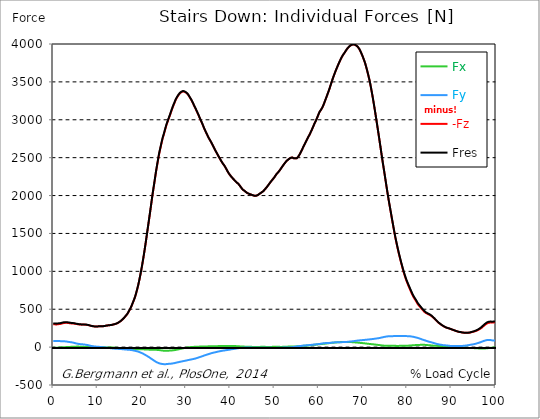
| Category |  Fx |  Fy |  -Fz |  Fres |
|---|---|---|---|---|
| 0.0 | -9.87 | 81.06 | 300.68 | 311.73 |
| 0.167348456675344 | -9.61 | 81.22 | 300.75 | 311.83 |
| 0.334696913350688 | -9.27 | 81.24 | 300.49 | 311.58 |
| 0.5020453700260321 | -8.63 | 80.74 | 299.02 | 310.01 |
| 0.669393826701376 | -8.05 | 80.57 | 298.9 | 309.84 |
| 0.83674228337672 | -7.43 | 80.36 | 299.57 | 310.44 |
| 1.0040907400520642 | -6.73 | 80.41 | 301.56 | 312.37 |
| 1.1621420602454444 | -6.07 | 80.19 | 303.34 | 314.04 |
| 1.3294905169207885 | -5.4 | 79.68 | 304.59 | 315.11 |
| 1.4968389735961325 | -4.64 | 79.14 | 305.43 | 315.78 |
| 1.6641874302714765 | -3.96 | 78.68 | 306.74 | 316.94 |
| 1.8315358869468206 | -3.35 | 78.41 | 309.16 | 319.22 |
| 1.9988843436221646 | -2.82 | 78.29 | 312.47 | 322.41 |
| 2.1662328002975086 | -2.22 | 78.15 | 315.49 | 325.32 |
| 2.333581256972853 | -1.74 | 77.76 | 317.91 | 327.61 |
| 2.5009297136481967 | -1.22 | 76.89 | 319.31 | 328.8 |
| 2.6682781703235405 | -0.68 | 75.85 | 319.89 | 329.13 |
| 2.8356266269988843 | -0.17 | 74.73 | 320.02 | 329.01 |
| 3.002975083674229 | 0.75 | 73.56 | 320.14 | 328.84 |
| 3.1703235403495724 | 1.17 | 71.71 | 319.48 | 327.86 |
| 3.337671997024917 | 1.59 | 69.95 | 318.71 | 326.77 |
| 3.4957233172182973 | 2.05 | 68.48 | 317.52 | 325.3 |
| 3.663071773893641 | 2.57 | 67.01 | 315.68 | 323.19 |
| 3.8304202305689854 | 3.04 | 65.5 | 313.83 | 321.08 |
| 3.997768687244329 | 3.43 | 64.31 | 312.91 | 319.89 |
| 4.165117143919673 | 4.09 | 62.61 | 312.43 | 319.03 |
| 4.332465600595017 | 4.8 | 60.68 | 312.2 | 318.37 |
| 4.499814057270361 | 5.1 | 58.81 | 311.43 | 317.23 |
| 4.667162513945706 | 5.5 | 56.49 | 310.18 | 315.61 |
| 4.834510970621049 | 6.02 | 53.44 | 308.57 | 313.5 |
| 5.001859427296393 | 6.24 | 50.58 | 306.73 | 311.23 |
| 5.169207883971737 | 6.32 | 48.52 | 305.13 | 309.37 |
| 5.336556340647081 | 6.47 | 46.46 | 303.63 | 307.61 |
| 5.503904797322425 | 6.55 | 44.32 | 301.85 | 305.6 |
| 5.671253253997769 | 6.57 | 42.31 | 300.2 | 303.73 |
| 5.82930457419115 | 6.32 | 40.95 | 299.17 | 302.55 |
| 5.996653030866494 | 6.04 | 39.68 | 298.22 | 301.47 |
| 6.164001487541838 | 5.73 | 38.55 | 297.34 | 300.45 |
| 6.331349944217181 | 5.15 | 37.7 | 296.62 | 299.64 |
| 6.498698400892526 | 4.4 | 37.03 | 296.64 | 299.58 |
| 6.66604685756787 | 3.85 | 36.33 | 297.03 | 299.91 |
| 6.833395314243213 | 3.39 | 35.4 | 297.19 | 300 |
| 7.000743770918558 | 3.06 | 34.2 | 296.98 | 299.68 |
| 7.168092227593902 | 2.97 | 32.69 | 296.34 | 298.92 |
| 7.335440684269246 | 3.07 | 31.08 | 295.44 | 297.83 |
| 7.50278914094459 | 3.22 | 29.48 | 294.13 | 296.36 |
| 7.6701375976199335 | 3.4 | 27.78 | 292.66 | 294.71 |
| 7.837486054295278 | 3.62 | 25.64 | 291.08 | 292.94 |
| 7.995537374488658 | 3.93 | 23.24 | 289 | 290.63 |
| 8.162885831164003 | 4.21 | 20.67 | 286.07 | 287.42 |
| 8.330234287839346 | 4.32 | 18.23 | 283.34 | 284.44 |
| 8.49758274451469 | 4.36 | 15.88 | 280.8 | 281.65 |
| 8.664931201190035 | 4.09 | 13.93 | 278.52 | 279.18 |
| 8.832279657865378 | 3.6 | 12.36 | 276.69 | 277.25 |
| 8.999628114540721 | 3.27 | 10.73 | 274.9 | 275.38 |
| 9.166976571216066 | 2.93 | 9.13 | 273.18 | 273.59 |
| 9.334325027891412 | 2.33 | 8.17 | 272.57 | 272.94 |
| 9.501673484566755 | 1.8 | 7.27 | 272.01 | 272.36 |
| 9.669021941242098 | 1.38 | 6.34 | 271.68 | 271.99 |
| 9.836370397917442 | 0.93 | 5.45 | 271.91 | 272.2 |
| 10.003718854592787 | 0.4 | 4.7 | 272.56 | 272.84 |
| 10.17106731126813 | -0.19 | 3.99 | 273.32 | 273.58 |
| 10.329118631461512 | -0.92 | 3.58 | 274.99 | 275.22 |
| 10.496467088136853 | -1.05 | 2.7 | 275.24 | 275.42 |
| 10.663815544812199 | -1.04 | 1.58 | 275.31 | 275.43 |
| 10.831164001487544 | -0.9 | 0.2 | 275.3 | 275.37 |
| 10.998512458162887 | -1.23 | -0.65 | 275.55 | 275.62 |
| 11.16586091483823 | -1.66 | -1.4 | 275.87 | 275.93 |
| 11.333209371513574 | -2.22 | -2.45 | 276.49 | 276.57 |
| 11.50055782818892 | -2.75 | -3.55 | 277.63 | 277.73 |
| 11.667906284864264 | -3.09 | -4.79 | 279.52 | 279.67 |
| 11.835254741539607 | -3.44 | -5.88 | 281.53 | 281.71 |
| 12.00260319821495 | -4.05 | -6.41 | 283.85 | 284.07 |
| 12.169951654890292 | -4.5 | -7.36 | 285.92 | 286.17 |
| 12.337300111565641 | -4.56 | -8.98 | 286.66 | 286.96 |
| 12.504648568240984 | -4.62 | -10.45 | 287.4 | 287.75 |
| 12.662699888434362 | -4.74 | -11.94 | 288.67 | 289.08 |
| 12.830048345109708 | -4.69 | -13.38 | 289.93 | 290.39 |
| 12.997396801785053 | -4.81 | -14.74 | 291.21 | 291.72 |
| 13.164745258460396 | -5.08 | -15.98 | 292.65 | 293.23 |
| 13.33209371513574 | -5.54 | -17.07 | 294.55 | 295.21 |
| 13.499442171811083 | -6.07 | -18.04 | 296.88 | 297.6 |
| 13.666790628486426 | -6.78 | -18.85 | 299.77 | 300.55 |
| 13.834139085161771 | -7.07 | -20.04 | 302.29 | 303.14 |
| 14.001487541837117 | -7.63 | -20.96 | 305.02 | 305.94 |
| 14.16883599851246 | -8.45 | -21.62 | 307.96 | 308.94 |
| 14.336184455187803 | -9.51 | -22.16 | 311.47 | 312.53 |
| 14.503532911863147 | -10.53 | -22.63 | 316.08 | 317.19 |
| 14.670881368538492 | -11.47 | -23.19 | 321.49 | 322.65 |
| 14.828932688731873 | -12.33 | -23.75 | 327.62 | 328.83 |
| 14.996281145407215 | -13.32 | -24.37 | 334.1 | 335.36 |
| 15.163629602082558 | -14.11 | -25.02 | 340.87 | 342.19 |
| 15.330978058757903 | -14.67 | -25.73 | 348.7 | 350.07 |
| 15.498326515433247 | -15.54 | -26.74 | 357.08 | 358.53 |
| 15.665674972108594 | -16.48 | -28.06 | 366.16 | 367.73 |
| 15.833023428783937 | -17.21 | -29.05 | 375.84 | 377.5 |
| 16.00037188545928 | -18.05 | -29.84 | 386.11 | 387.83 |
| 16.167720342134626 | -18.74 | -30.54 | 397.23 | 399.02 |
| 16.335068798809967 | -19.18 | -31.44 | 409.01 | 410.86 |
| 16.502417255485312 | -19.6 | -32.48 | 420.75 | 422.67 |
| 16.669765712160658 | -20.21 | -33.37 | 432.83 | 434.81 |
| 16.837114168836 | -20.82 | -34.09 | 447.67 | 449.69 |
| 17.004462625511344 | -21.51 | -34.79 | 464.92 | 466.99 |
| 17.16251394570472 | -22.24 | -35.45 | 482.3 | 484.4 |
| 17.32986240238007 | -22.81 | -36.28 | 500.17 | 502.32 |
| 17.497210859055414 | -23.02 | -37.58 | 519.14 | 521.32 |
| 17.664559315730756 | -23.27 | -39.21 | 540.38 | 542.6 |
| 17.8319077724061 | -23.49 | -41.04 | 564.66 | 566.92 |
| 17.999256229081443 | -24.17 | -42.94 | 589.12 | 591.45 |
| 18.166604685756788 | -24.93 | -44.83 | 613.77 | 616.18 |
| 18.333953142432133 | -25.45 | -46.51 | 638.46 | 640.91 |
| 18.501301599107478 | -25.83 | -48.62 | 667.01 | 669.53 |
| 18.668650055782823 | -26.22 | -51.27 | 700.59 | 703.2 |
| 18.835998512458165 | -26.58 | -54.04 | 736.41 | 739.11 |
| 19.00334696913351 | -26.78 | -56.64 | 772.85 | 775.62 |
| 19.170695425808855 | -27 | -59.49 | 811.48 | 814.33 |
| 19.338043882484197 | -27.22 | -62.8 | 856.07 | 859.03 |
| 19.496095202677576 | -27.7 | -66.66 | 902.4 | 905.52 |
| 19.66344365935292 | -28.02 | -70.61 | 951.25 | 954.52 |
| 19.830792116028263 | -28.24 | -74.58 | 1002.14 | 1005.55 |
| 19.998140572703612 | -28.56 | -78.8 | 1055.29 | 1058.84 |
| 20.165489029378953 | -28.99 | -83.57 | 1111.63 | 1115.37 |
| 20.3328374860543 | -29.49 | -88.64 | 1170.52 | 1174.46 |
| 20.500185942729644 | -29.99 | -93.66 | 1231.01 | 1235.15 |
| 20.667534399404985 | -30.45 | -98.8 | 1292.83 | 1297.16 |
| 20.83488285608033 | -30.98 | -104.39 | 1357.5 | 1362.06 |
| 21.002231312755672 | -31.43 | -110.25 | 1424.52 | 1429.31 |
| 21.16957976943102 | -31.8 | -116.24 | 1492.1 | 1497.14 |
| 21.336928226106362 | -32.42 | -122.18 | 1559.61 | 1564.9 |
| 21.504276682781704 | -33.05 | -128.14 | 1627.12 | 1632.66 |
| 21.67162513945705 | -33.62 | -134.21 | 1694.7 | 1700.49 |
| 21.82967645965043 | -33.81 | -140.67 | 1762.87 | 1768.94 |
| 21.997024916325774 | -34.02 | -147.49 | 1832.67 | 1839.04 |
| 22.16437337300112 | -34.23 | -154.32 | 1902.55 | 1909.23 |
| 22.33172182967646 | -34.38 | -161.28 | 1973.12 | 1980.11 |
| 22.499070286351806 | -34.67 | -167.92 | 2040.54 | 2047.84 |
| 22.666418743027148 | -34.96 | -174.33 | 2103.62 | 2111.23 |
| 22.833767199702496 | -35.24 | -180.73 | 2166.27 | 2174.18 |
| 23.00111565637784 | -35.4 | -187.2 | 2230.76 | 2238.98 |
| 23.168464113053183 | -35.63 | -193.25 | 2295.61 | 2304.11 |
| 23.335812569728528 | -36.27 | -198.36 | 2355.71 | 2364.43 |
| 23.50316102640387 | -36.98 | -202.93 | 2412.2 | 2421.11 |
| 23.670509483079215 | -37.68 | -207.42 | 2468.08 | 2477.16 |
| 23.83785793975456 | -38.48 | -211.75 | 2523.3 | 2532.56 |
| 23.995909259947936 | -39.84 | -214.85 | 2572.31 | 2581.67 |
| 24.163257716623285 | -41.15 | -217.18 | 2615.1 | 2624.52 |
| 24.330606173298627 | -42.65 | -219.55 | 2658.87 | 2668.35 |
| 24.49795462997397 | -44.15 | -221.92 | 2702.64 | 2712.19 |
| 24.665303086649313 | -45.49 | -223.79 | 2744.71 | 2754.28 |
| 24.83265154332466 | -46.6 | -224.42 | 2778.06 | 2787.59 |
| 25.0 | -47.57 | -224.9 | 2811.29 | 2820.75 |
| 25.167348456675345 | -48.35 | -225.14 | 2846.09 | 2855.46 |
| 25.334696913350694 | -48.88 | -225.23 | 2882.27 | 2891.54 |
| 25.502045370026035 | -49.2 | -224.83 | 2916.69 | 2925.82 |
| 25.669393826701377 | -49.1 | -223.78 | 2945.99 | 2954.95 |
| 25.836742283376722 | -48.86 | -222.55 | 2973.88 | 2982.66 |
| 26.004090740052067 | -48.78 | -221.22 | 3001.67 | 3010.26 |
| 26.17143919672741 | -46.8 | -220.91 | 3028.11 | 3036.58 |
| 26.329490516920792 | -44.92 | -220.56 | 3055.15 | 3063.49 |
| 26.49683897359613 | -43.84 | -219.71 | 3083.92 | 3092.1 |
| 26.66418743027148 | -43.55 | -217.98 | 3112.31 | 3120.3 |
| 26.831535886946828 | -43.66 | -215.9 | 3140.47 | 3148.25 |
| 26.998884343622166 | -42.96 | -214.74 | 3166.88 | 3174.51 |
| 27.166232800297514 | -41.87 | -213.29 | 3192.2 | 3199.67 |
| 27.333581256972852 | -40.02 | -211.6 | 3215.5 | 3222.78 |
| 27.5009297136482 | -38.5 | -209.04 | 3239.5 | 3246.54 |
| 27.668278170323543 | -36.81 | -207.19 | 3263.53 | 3270.39 |
| 27.835626626998888 | -35.17 | -204.24 | 3281.5 | 3288.12 |
| 28.002975083674233 | -33.26 | -201.81 | 3298.52 | 3304.94 |
| 28.170323540349575 | -31.17 | -199.83 | 3314.64 | 3320.91 |
| 28.33767199702492 | -28.89 | -197.84 | 3328.75 | 3334.85 |
| 28.50502045370026 | -26.3 | -195.78 | 3341.49 | 3347.45 |
| 28.663071773893645 | -24.01 | -193.36 | 3352.89 | 3358.68 |
| 28.830420230568986 | -21.98 | -191.16 | 3361.24 | 3366.89 |
| 28.99776868724433 | -19.82 | -189.39 | 3366.78 | 3372.32 |
| 29.165117143919673 | -17.62 | -187.51 | 3370.92 | 3376.34 |
| 29.33246560059502 | -15.44 | -185.43 | 3374.49 | 3379.8 |
| 29.499814057270367 | -13.2 | -183.54 | 3373.58 | 3378.79 |
| 29.66716251394571 | -11.31 | -181.48 | 3368.81 | 3373.92 |
| 29.834510970621054 | -9.35 | -179.6 | 3363.42 | 3368.44 |
| 30.00185942729639 | -7.62 | -177.46 | 3357.93 | 3362.85 |
| 30.169207883971744 | -6.03 | -175.24 | 3350.54 | 3355.35 |
| 30.33655634064708 | -4.54 | -173.04 | 3340.66 | 3345.38 |
| 30.50390479732243 | -3.03 | -170.93 | 3327.38 | 3332.02 |
| 30.671253253997772 | -1.75 | -168.83 | 3312.35 | 3316.9 |
| 30.829304574191156 | -0.94 | -166.72 | 3295.85 | 3300.32 |
| 30.996653030866494 | -0.08 | -164.68 | 3280.08 | 3284.47 |
| 31.164001487541842 | 0.67 | -162.78 | 3264.17 | 3268.48 |
| 31.331349944217187 | 0.98 | -160.86 | 3244.84 | 3249.09 |
| 31.498698400892525 | 1.61 | -158.84 | 3225.93 | 3230.1 |
| 31.666046857567874 | 2.63 | -156.65 | 3205.76 | 3209.86 |
| 31.833395314243212 | 3.44 | -154.48 | 3183.82 | 3187.85 |
| 32.00074377091856 | 4.28 | -152.36 | 3163.29 | 3167.24 |
| 32.1680922275939 | 5.03 | -149.87 | 3144.21 | 3148.08 |
| 32.33544068426925 | 5.24 | -146.91 | 3123.69 | 3127.43 |
| 32.50278914094459 | 5.21 | -143.68 | 3102.5 | 3106.1 |
| 32.670137597619934 | 5.29 | -140.23 | 3081.11 | 3084.57 |
| 32.83748605429528 | 5.49 | -137.03 | 3059.19 | 3062.54 |
| 33.004834510970625 | 6.45 | -133.22 | 3035.65 | 3038.87 |
| 33.162885831164004 | 7.09 | -129.72 | 3012.99 | 3016.09 |
| 33.33023428783935 | 7.34 | -126.86 | 2991.66 | 2994.67 |
| 33.497582744514695 | 7.42 | -124.08 | 2970.13 | 2973.06 |
| 33.664931201190036 | 7.48 | -120.71 | 2947.52 | 2950.34 |
| 33.83227965786538 | 7.8 | -117.16 | 2925.12 | 2927.81 |
| 33.99962811454073 | 8.11 | -112.86 | 2899.65 | 2902.21 |
| 34.16697657121607 | 8.13 | -109.4 | 2876.89 | 2879.34 |
| 34.33432502789141 | 8.49 | -106.21 | 2855.71 | 2858.06 |
| 34.50167348456676 | 8.79 | -103.18 | 2834.92 | 2837.18 |
| 34.6690219412421 | 9.14 | -100.22 | 2814.54 | 2816.72 |
| 34.83637039791744 | 9.5 | -97.17 | 2794.07 | 2796.18 |
| 35.00371885459279 | 9.86 | -94.13 | 2773.96 | 2775.99 |
| 35.17106731126814 | 10.26 | -91.06 | 2755.22 | 2757.16 |
| 35.338415767943474 | 10.59 | -87.76 | 2738.41 | 2740.24 |
| 35.49646708813686 | 10.84 | -84.44 | 2722.03 | 2723.75 |
| 35.6638155448122 | 11.03 | -81.5 | 2704.1 | 2705.74 |
| 35.831164001487544 | 11.23 | -78.92 | 2685.6 | 2687.18 |
| 35.998512458162885 | 11.46 | -76.37 | 2667.04 | 2668.56 |
| 36.165860914838234 | 11.68 | -73.95 | 2648.14 | 2649.61 |
| 36.333209371513576 | 11.89 | -71.63 | 2628.41 | 2629.83 |
| 36.50055782818892 | 12.1 | -69.35 | 2608.96 | 2610.33 |
| 36.667906284864266 | 12.31 | -67.11 | 2590.53 | 2591.84 |
| 36.83525474153961 | 12.52 | -64.83 | 2572.62 | 2573.88 |
| 37.002603198214956 | 12.72 | -62.45 | 2554.66 | 2555.86 |
| 37.1699516548903 | 12.92 | -60.06 | 2536.81 | 2537.95 |
| 37.337300111565646 | 13.19 | -57.85 | 2519.45 | 2520.54 |
| 37.50464856824098 | 13.58 | -55.77 | 2502.52 | 2503.56 |
| 37.66269988843437 | 14.06 | -53.87 | 2485.49 | 2486.49 |
| 37.83004834510971 | 14.56 | -52.03 | 2468.29 | 2469.25 |
| 37.99739680178505 | 15.08 | -50.2 | 2451.46 | 2452.38 |
| 38.16474525846039 | 15.36 | -48.48 | 2435.29 | 2436.18 |
| 38.33209371513574 | 15.77 | -46.95 | 2421.36 | 2422.21 |
| 38.49944217181109 | 15.78 | -45.58 | 2407.93 | 2408.74 |
| 38.666790628486424 | 15.5 | -44.21 | 2394.44 | 2395.22 |
| 38.83413908516178 | 15.24 | -42.74 | 2378.36 | 2379.13 |
| 39.001487541837115 | 15.28 | -40.99 | 2361.84 | 2362.57 |
| 39.16883599851246 | 15.11 | -39.48 | 2343.12 | 2343.84 |
| 39.336184455187805 | 15.19 | -38 | 2325.54 | 2326.25 |
| 39.503532911863154 | 15.14 | -36.55 | 2308.19 | 2308.89 |
| 39.670881368538495 | 14.88 | -35.01 | 2292.5 | 2293.18 |
| 39.83822982521384 | 14.63 | -33.23 | 2278.75 | 2279.39 |
| 39.996281145407224 | 14.34 | -31.53 | 2265.71 | 2266.33 |
| 40.163629602082565 | 14.12 | -29.85 | 2253.43 | 2254.02 |
| 40.33097805875791 | 13.95 | -28.18 | 2241.53 | 2242.11 |
| 40.498326515433256 | 14.04 | -26.62 | 2230.68 | 2231.23 |
| 40.6656749721086 | 14.34 | -25.18 | 2220.63 | 2221.17 |
| 40.83302342878393 | 14.48 | -23.9 | 2209.84 | 2210.37 |
| 41.00037188545929 | 14.31 | -22.32 | 2199.4 | 2199.93 |
| 41.16772034213463 | 13.82 | -20.64 | 2188.78 | 2189.3 |
| 41.33506879880997 | 13.11 | -18.73 | 2181.26 | 2181.74 |
| 41.50241725548531 | 12.42 | -17.18 | 2170.82 | 2171.29 |
| 41.66976571216066 | 11.79 | -15.54 | 2163.27 | 2163.72 |
| 41.837114168836 | 10.97 | -13.74 | 2153.76 | 2154.19 |
| 42.004462625511344 | 10.27 | -12.48 | 2142.56 | 2142.98 |
| 42.17181108218669 | 9.68 | -11.48 | 2129.39 | 2129.81 |
| 42.32986240238007 | 9.09 | -10.47 | 2115.29 | 2115.7 |
| 42.497210859055414 | 8.51 | -9.46 | 2101.65 | 2102.06 |
| 42.66455931573076 | 7.96 | -8.43 | 2088.79 | 2089.2 |
| 42.831907772406105 | 7.42 | -7.6 | 2078.18 | 2078.6 |
| 42.999256229081446 | 7.02 | -7.24 | 2071.22 | 2071.64 |
| 43.16660468575679 | 6.61 | -6.88 | 2064.26 | 2064.68 |
| 43.33395314243214 | 6.08 | -6.49 | 2056.55 | 2056.97 |
| 43.50130159910748 | 5.42 | -6.08 | 2048.01 | 2048.44 |
| 43.66865005578282 | 5.1 | -5.86 | 2040.79 | 2041.22 |
| 43.83599851245817 | 4.94 | -5.7 | 2034.14 | 2034.58 |
| 44.00334696913351 | 4.78 | -5.43 | 2028.46 | 2028.9 |
| 44.17069542580886 | 4.63 | -4.91 | 2024.61 | 2025.05 |
| 44.3380438824842 | 4.51 | -5.12 | 2020.83 | 2021.27 |
| 44.49609520267758 | 4.41 | -5.57 | 2017.08 | 2017.52 |
| 44.66344365935292 | 3.92 | -6.15 | 2013.47 | 2013.91 |
| 44.83079211602827 | 3.3 | -6.78 | 2009.92 | 2010.36 |
| 44.99814057270361 | 2.75 | -7.22 | 2006.23 | 2006.67 |
| 45.16548902937895 | 2.35 | -7.29 | 2002.28 | 2002.72 |
| 45.332837486054295 | 1.97 | -7.32 | 1998.64 | 1999.07 |
| 45.500185942729644 | 1.72 | -7.06 | 1996.86 | 1997.3 |
| 45.66753439940499 | 1.46 | -6.81 | 1995.09 | 1995.52 |
| 45.83488285608033 | 1.55 | -6.85 | 1997.26 | 1997.69 |
| 46.00223131275568 | 1.56 | -6.82 | 2000.37 | 2000.8 |
| 46.16957976943102 | 1.65 | -6.88 | 2004.98 | 2005.41 |
| 46.336928226106366 | 1.89 | -7.01 | 2011.07 | 2011.49 |
| 46.50427668278171 | 2.34 | -7.16 | 2017.86 | 2018.28 |
| 46.671625139457056 | 2.78 | -7.3 | 2024.65 | 2025.07 |
| 46.829676459650436 | 3.2 | -7.38 | 2031.45 | 2031.88 |
| 46.99702491632577 | 3.55 | -7.27 | 2038.31 | 2038.73 |
| 47.16437337300112 | 3.91 | -7.15 | 2045.16 | 2045.59 |
| 47.33172182967646 | 3.97 | -7.36 | 2051.62 | 2052.06 |
| 47.49907028635181 | 4.12 | -7.59 | 2059.21 | 2059.65 |
| 47.66641874302716 | 3.61 | -7.73 | 2071.41 | 2071.85 |
| 47.83376719970249 | 3.14 | -8.08 | 2081.93 | 2082.37 |
| 48.001115656377834 | 3.01 | -8.36 | 2093.8 | 2094.24 |
| 48.16846411305319 | 3.05 | -8.7 | 2104.66 | 2105.1 |
| 48.33581256972853 | 2.8 | -8.88 | 2117.56 | 2118 |
| 48.50316102640387 | 2.61 | -9.01 | 2129.89 | 2130.33 |
| 48.67050948307921 | 2.47 | -9.11 | 2141.77 | 2142.21 |
| 48.837857939754564 | 2.41 | -9.21 | 2155.72 | 2156.17 |
| 49.005206396429905 | 2.48 | -9.35 | 2169.97 | 2170.42 |
| 49.163257716623285 | 2.72 | -9.62 | 2182.33 | 2182.78 |
| 49.33060617329863 | 2.94 | -9.86 | 2194.81 | 2195.26 |
| 49.49795462997397 | 3.1 | -10.22 | 2206.28 | 2206.74 |
| 49.66530308664932 | 3.41 | -10.54 | 2218.22 | 2218.68 |
| 49.832651543324666 | 3.61 | -10.61 | 2230.82 | 2231.28 |
| 50.0 | 3.76 | -10.59 | 2243.61 | 2244.08 |
| 50.16734845667534 | 3.9 | -10.43 | 2257.94 | 2258.41 |
| 50.33469691335069 | 4.1 | -10.21 | 2272.5 | 2272.98 |
| 50.50204537002604 | 4.47 | -9.9 | 2286.69 | 2287.17 |
| 50.66939382670139 | 4.36 | -9.58 | 2298.65 | 2299.12 |
| 50.836742283376715 | 3.92 | -8.97 | 2307.12 | 2307.56 |
| 51.00409074005207 | 3.44 | -8.51 | 2319.5 | 2319.93 |
| 51.17143919672741 | 3.25 | -8.15 | 2332.02 | 2332.44 |
| 51.32949051692079 | 3.01 | -7.78 | 2345.87 | 2346.28 |
| 51.496838973596134 | 2.87 | -7.45 | 2360.14 | 2360.54 |
| 51.66418743027148 | 2.97 | -7.24 | 2374.1 | 2374.5 |
| 51.831535886946824 | 3.19 | -6.97 | 2388.45 | 2388.85 |
| 51.99888434362217 | 3.51 | -6.48 | 2401.86 | 2402.25 |
| 52.16623280029752 | 4.29 | -6.17 | 2415.04 | 2415.44 |
| 52.33358125697285 | 5.01 | -5.89 | 2428.18 | 2428.57 |
| 52.5009297136482 | 5.45 | -5.47 | 2440.86 | 2441.27 |
| 52.668278170323546 | 5.66 | -4.85 | 2452.93 | 2453.35 |
| 52.835626626998895 | 5.91 | -4.54 | 2462.73 | 2463.15 |
| 53.00297508367424 | 6.29 | -4.53 | 2470.21 | 2470.64 |
| 53.17032354034958 | 6.92 | -4.56 | 2478.22 | 2478.66 |
| 53.33767199702492 | 7.54 | -4.49 | 2485.73 | 2486.18 |
| 53.50502045370027 | 8.09 | -4.06 | 2491.24 | 2491.68 |
| 53.663071773893655 | 8.52 | -3.38 | 2497.29 | 2497.72 |
| 53.83042023056899 | 8.81 | -2.45 | 2501.18 | 2501.59 |
| 53.99776868724433 | 8.98 | -1.37 | 2502.32 | 2502.7 |
| 54.16511714391967 | 8.53 | 0.05 | 2497.13 | 2497.47 |
| 54.33246560059503 | 8.02 | 1.49 | 2492.66 | 2492.97 |
| 54.49981405727037 | 7.73 | 2.87 | 2491.57 | 2491.85 |
| 54.667162513945705 | 8.04 | 4.82 | 2490.6 | 2490.85 |
| 54.834510970621054 | 8.76 | 7.07 | 2489.98 | 2490.21 |
| 55.0018594272964 | 9.71 | 8.82 | 2491.24 | 2491.46 |
| 55.169207883971744 | 10.6 | 9.7 | 2498.93 | 2499.15 |
| 55.336556340647086 | 11.51 | 10.59 | 2509.84 | 2510.07 |
| 55.50390479732243 | 12.48 | 11.7 | 2525.07 | 2525.31 |
| 55.671253253997776 | 13.47 | 12.85 | 2541.24 | 2541.49 |
| 55.83860171067312 | 14.23 | 14.3 | 2560.28 | 2560.54 |
| 55.9966530308665 | 14.84 | 15.91 | 2579.98 | 2580.27 |
| 56.16400148754184 | 15.56 | 17.23 | 2599.54 | 2599.84 |
| 56.33134994421718 | 16.25 | 18.37 | 2618.99 | 2619.3 |
| 56.498698400892536 | 16.79 | 19.69 | 2639.38 | 2639.71 |
| 56.66604685756788 | 17.45 | 20.72 | 2658.7 | 2659.04 |
| 56.83339531424321 | 18.15 | 21.7 | 2677.96 | 2678.32 |
| 57.00074377091856 | 18.89 | 22.49 | 2697.55 | 2697.92 |
| 57.16809222759391 | 19.58 | 23.26 | 2717.3 | 2717.69 |
| 57.33544068426925 | 20.12 | 24.07 | 2736.81 | 2737.21 |
| 57.5027891409446 | 20.78 | 24.95 | 2756.5 | 2756.92 |
| 57.670137597619934 | 21.48 | 25.77 | 2775.76 | 2776.2 |
| 57.83748605429528 | 22.5 | 26.42 | 2793.9 | 2794.35 |
| 58.004834510970625 | 23.64 | 27.2 | 2812.64 | 2813.11 |
| 58.16288583116401 | 24.75 | 28.35 | 2833.17 | 2833.66 |
| 58.330234287839346 | 25.78 | 29.67 | 2854.13 | 2854.65 |
| 58.497582744514695 | 27.02 | 30.88 | 2875.59 | 2876.13 |
| 58.66493120119004 | 28.25 | 32.04 | 2898.51 | 2899.08 |
| 58.832279657865385 | 29.59 | 33.1 | 2921.26 | 2921.85 |
| 58.999628114540734 | 30.86 | 34.16 | 2944.01 | 2944.63 |
| 59.16697657121607 | 31.77 | 35.31 | 2965.56 | 2966.18 |
| 59.33432502789142 | 32.49 | 36.58 | 2985.4 | 2986.04 |
| 59.50167348456676 | 33.34 | 37.75 | 3005.97 | 3006.62 |
| 59.66902194124211 | 34.81 | 38.46 | 3030.12 | 3030.79 |
| 59.83637039791745 | 36.17 | 39.32 | 3054.05 | 3054.74 |
| 60.00371885459278 | 37.64 | 40.08 | 3077.98 | 3078.69 |
| 60.17106731126813 | 38.87 | 41 | 3101.55 | 3102.28 |
| 60.33841576794349 | 39.44 | 43.01 | 3116.22 | 3116.97 |
| 60.49646708813685 | 40.14 | 45.03 | 3130.63 | 3131.4 |
| 60.6638155448122 | 41.32 | 46.95 | 3145.73 | 3146.55 |
| 60.831164001487544 | 42.38 | 48.56 | 3163.32 | 3164.17 |
| 60.99851245816289 | 43.25 | 49.71 | 3184.8 | 3185.68 |
| 61.16586091483824 | 44.19 | 51.19 | 3208.84 | 3209.75 |
| 61.333209371513576 | 45.22 | 52.21 | 3234.39 | 3235.33 |
| 61.50055782818892 | 46.33 | 52.79 | 3260.3 | 3261.25 |
| 61.667906284864266 | 47.48 | 53.21 | 3286.43 | 3287.4 |
| 61.835254741539615 | 48.64 | 53.51 | 3312.72 | 3313.71 |
| 62.002603198214956 | 49.9 | 53.76 | 3338.95 | 3339.95 |
| 62.16995165489029 | 51.26 | 54.21 | 3365.46 | 3366.47 |
| 62.33730011156564 | 52.49 | 55.03 | 3392.87 | 3393.9 |
| 62.504648568240995 | 53.61 | 56.07 | 3421.17 | 3422.23 |
| 62.67199702491633 | 54.92 | 56.8 | 3452.08 | 3453.16 |
| 62.83004834510971 | 56.02 | 57.79 | 3482.86 | 3483.96 |
| 62.99739680178505 | 56.94 | 59.03 | 3512.28 | 3513.41 |
| 63.1647452584604 | 57.7 | 60.05 | 3540.85 | 3542 |
| 63.33209371513575 | 58.45 | 61.07 | 3568.48 | 3569.65 |
| 63.4994421718111 | 59.24 | 61.91 | 3594.88 | 3596.08 |
| 63.666790628486424 | 60.06 | 62.58 | 3620.73 | 3621.94 |
| 63.83413908516177 | 61.02 | 63.15 | 3645.71 | 3646.94 |
| 64.00148754183712 | 61.94 | 63.89 | 3669.62 | 3670.87 |
| 64.16883599851248 | 62.92 | 64.25 | 3692.98 | 3694.25 |
| 64.3361844551878 | 63.93 | 64.56 | 3715.82 | 3717.11 |
| 64.50353291186315 | 64.93 | 64.75 | 3738.69 | 3740 |
| 64.6708813685385 | 65.51 | 65.04 | 3760.54 | 3761.86 |
| 64.83822982521384 | 65.84 | 65.29 | 3781.67 | 3783 |
| 65.00557828188919 | 66.04 | 65.5 | 3802.28 | 3803.61 |
| 65.16362960208257 | 66.19 | 65.68 | 3821.86 | 3823.19 |
| 65.3309780587579 | 66.43 | 65.77 | 3839.35 | 3840.68 |
| 65.49832651543326 | 66.58 | 66.09 | 3855.3 | 3856.62 |
| 65.6656749721086 | 66.97 | 66.68 | 3869.28 | 3870.62 |
| 65.83302342878395 | 67.16 | 67.09 | 3883.29 | 3884.64 |
| 66.00037188545929 | 66.91 | 67.25 | 3898.11 | 3899.46 |
| 66.16772034213463 | 66.45 | 67.8 | 3913.36 | 3914.71 |
| 66.33506879880998 | 66.26 | 68.46 | 3927.78 | 3929.14 |
| 66.50241725548531 | 66.24 | 69.13 | 3941.34 | 3942.71 |
| 66.66976571216065 | 66.58 | 70.06 | 3952.59 | 3953.99 |
| 66.83711416883601 | 66.68 | 71.58 | 3963.02 | 3964.44 |
| 67.00446262551135 | 66.78 | 73.1 | 3973.44 | 3974.89 |
| 67.1718110821867 | 66.68 | 73.69 | 3979.3 | 3980.76 |
| 67.32986240238007 | 66.58 | 74.5 | 3984.87 | 3986.35 |
| 67.49721085905541 | 65.9 | 75.7 | 3989.45 | 3990.94 |
| 67.66455931573076 | 64.91 | 76.98 | 3992.28 | 3993.78 |
| 67.83190777240611 | 64.37 | 78.27 | 3994.09 | 3995.6 |
| 67.99925622908145 | 63.32 | 79.55 | 3993.25 | 3994.78 |
| 68.16660468575678 | 62.56 | 80.91 | 3989.99 | 3991.54 |
| 68.33395314243214 | 61.83 | 82.47 | 3984.34 | 3985.92 |
| 68.50130159910749 | 61.14 | 83.95 | 3978.32 | 3979.92 |
| 68.66865005578282 | 60.37 | 85.23 | 3971.27 | 3972.88 |
| 68.83599851245816 | 59.31 | 86.24 | 3961.71 | 3963.34 |
| 69.00334696913352 | 58.15 | 87.26 | 3949.19 | 3950.84 |
| 69.17069542580886 | 57.08 | 88.33 | 3934.46 | 3936.12 |
| 69.3380438824842 | 55.96 | 89.37 | 3915.06 | 3916.74 |
| 69.50539233915956 | 54.96 | 90.3 | 3895.1 | 3896.79 |
| 69.66344365935292 | 53.98 | 91.23 | 3873.12 | 3874.83 |
| 69.83079211602826 | 53 | 92.17 | 3850.12 | 3851.85 |
| 69.99814057270362 | 52.1 | 93.03 | 3825.52 | 3827.27 |
| 70.16548902937896 | 51.11 | 93.92 | 3799.21 | 3800.97 |
| 70.33283748605429 | 49.97 | 94.95 | 3772.29 | 3774.07 |
| 70.50018594272964 | 48.82 | 95.87 | 3744.06 | 3745.87 |
| 70.667534399405 | 47.56 | 96.62 | 3709.52 | 3711.34 |
| 70.83488285608033 | 46.18 | 97.7 | 3673.89 | 3675.73 |
| 71.00223131275568 | 44.99 | 98.74 | 3636.88 | 3638.74 |
| 71.16957976943102 | 43.99 | 99.73 | 3597.39 | 3599.29 |
| 71.33692822610637 | 42.98 | 100.78 | 3557.13 | 3559.05 |
| 71.50427668278171 | 41.84 | 102.12 | 3517.06 | 3519.03 |
| 71.67162513945706 | 40.73 | 103.34 | 3468.98 | 3470.99 |
| 71.8389735961324 | 39.69 | 104.35 | 3416.63 | 3418.68 |
| 71.99702491632577 | 38.68 | 105.33 | 3363.8 | 3365.89 |
| 72.16437337300113 | 37.69 | 106.5 | 3310.06 | 3312.2 |
| 72.33172182967647 | 36.61 | 107.65 | 3252.87 | 3255.08 |
| 72.49907028635181 | 35.34 | 109.04 | 3194.37 | 3196.64 |
| 72.66641874302715 | 34.18 | 110.6 | 3134 | 3136.35 |
| 72.8337671997025 | 33.13 | 111.88 | 3073.01 | 3075.42 |
| 73.00111565637783 | 31.9 | 113.21 | 3009.83 | 3012.32 |
| 73.16846411305319 | 30.71 | 114.41 | 2947.13 | 2949.7 |
| 73.33581256972853 | 29.58 | 116.05 | 2884.14 | 2886.81 |
| 73.50316102640387 | 28.45 | 117.69 | 2820.4 | 2823.18 |
| 73.67050948307921 | 27.34 | 119.19 | 2756.02 | 2758.92 |
| 73.83785793975457 | 26.05 | 121.03 | 2690.54 | 2693.58 |
| 74.00520639642991 | 24.61 | 123.38 | 2625.03 | 2628.25 |
| 74.16325771662328 | 22.94 | 125.61 | 2557.44 | 2560.83 |
| 74.33060617329863 | 21.79 | 127.82 | 2491.57 | 2495.14 |
| 74.49795462997398 | 20.56 | 130.12 | 2426.94 | 2430.72 |
| 74.66530308664932 | 19.58 | 132.88 | 2365.66 | 2369.7 |
| 74.83265154332466 | 18.81 | 134.74 | 2303.79 | 2308.05 |
| 75.00000000000001 | 17.93 | 136.44 | 2240.67 | 2245.18 |
| 75.16734845667534 | 17.38 | 137.98 | 2177.61 | 2182.36 |
| 75.3346969133507 | 17.12 | 139.59 | 2114.38 | 2119.4 |
| 75.50204537002605 | 17.25 | 141.26 | 2052.13 | 2057.45 |
| 75.66939382670138 | 17.36 | 142.37 | 1990.95 | 1996.51 |
| 75.83674228337672 | 17.42 | 143.17 | 1931.63 | 1937.41 |
| 76.00409074005208 | 17.25 | 143.45 | 1875.6 | 1881.58 |
| 76.17143919672742 | 17.05 | 143.77 | 1820.64 | 1826.83 |
| 76.33878765340276 | 16.82 | 144.09 | 1764.68 | 1771.12 |
| 76.49683897359614 | 16.77 | 144.37 | 1709.28 | 1715.97 |
| 76.66418743027148 | 16.64 | 144.56 | 1654.24 | 1661.18 |
| 76.83153588694682 | 16.56 | 144.73 | 1599.31 | 1606.55 |
| 76.99888434362218 | 16.62 | 145.23 | 1545.56 | 1553.15 |
| 77.16623280029752 | 16.58 | 145.52 | 1492.01 | 1499.91 |
| 77.33358125697285 | 16.52 | 146.05 | 1441.13 | 1449.34 |
| 77.5009297136482 | 16.37 | 146.42 | 1394.78 | 1403.32 |
| 77.66827817032356 | 16.14 | 146.78 | 1348.65 | 1357.49 |
| 77.83562662699889 | 16.11 | 146.98 | 1304.58 | 1313.74 |
| 78.00297508367423 | 16.19 | 147.11 | 1262.05 | 1271.52 |
| 78.17032354034959 | 16.32 | 147.17 | 1220.68 | 1230.46 |
| 78.33767199702493 | 16.41 | 147.16 | 1180.99 | 1191.09 |
| 78.50502045370027 | 16.48 | 147.02 | 1141.85 | 1152.27 |
| 78.67236891037561 | 16.65 | 146.96 | 1103.74 | 1114.49 |
| 78.83042023056899 | 16.82 | 147.1 | 1066.6 | 1077.7 |
| 78.99776868724433 | 17.01 | 147.08 | 1030.64 | 1042.07 |
| 79.16511714391969 | 17.21 | 146.9 | 996.42 | 1008.16 |
| 79.33246560059503 | 17.42 | 146.63 | 963.99 | 976.04 |
| 79.49981405727036 | 17.47 | 145.98 | 932.67 | 945.03 |
| 79.66716251394571 | 17.62 | 145.47 | 902.99 | 915.65 |
| 79.83451097062107 | 18 | 145.2 | 874.71 | 887.66 |
| 80.00185942729641 | 18.46 | 144.82 | 850.28 | 863.54 |
| 80.16920788397174 | 18.96 | 144.41 | 826.3 | 839.87 |
| 80.33655634064709 | 19.58 | 144.03 | 802.95 | 816.86 |
| 80.50390479732243 | 20.45 | 143.43 | 779.98 | 794.2 |
| 80.67125325399778 | 21.24 | 142.44 | 757.22 | 771.63 |
| 80.83860171067312 | 21.94 | 141.2 | 734.71 | 749.26 |
| 80.99665303086651 | 22.76 | 139.8 | 712.7 | 727.38 |
| 81.16400148754184 | 23.55 | 138.31 | 691.34 | 706.16 |
| 81.3313499442172 | 24.4 | 136.46 | 671.46 | 686.29 |
| 81.49869840089255 | 25.19 | 134.34 | 653.68 | 668.44 |
| 81.66604685756786 | 25.8 | 131.86 | 638.1 | 652.71 |
| 81.83339531424322 | 26.42 | 128.97 | 623.03 | 637.4 |
| 82.00074377091858 | 27.11 | 126.84 | 607.09 | 621.38 |
| 82.16809222759392 | 27.79 | 124.49 | 590.51 | 604.68 |
| 82.33544068426926 | 28.36 | 121.99 | 573.37 | 587.39 |
| 82.50278914094459 | 28.83 | 119.39 | 558.49 | 572.29 |
| 82.67013759761994 | 29.14 | 116.28 | 547.28 | 560.69 |
| 82.83748605429528 | 29.35 | 112.72 | 537.09 | 549.98 |
| 83.00483451097062 | 29.58 | 109.24 | 524.97 | 537.42 |
| 83.17218296764597 | 29.81 | 105.75 | 512.81 | 524.82 |
| 83.33023428783935 | 30.03 | 102.18 | 501.34 | 512.88 |
| 83.4975827445147 | 30.12 | 98.72 | 490.64 | 501.71 |
| 83.66493120119004 | 30.08 | 95.55 | 480.04 | 490.69 |
| 83.83227965786537 | 29.94 | 92.55 | 469.65 | 479.9 |
| 83.99962811454073 | 29.65 | 89.51 | 460.01 | 469.84 |
| 84.16697657121607 | 28.99 | 86.17 | 452.3 | 461.62 |
| 84.33432502789142 | 28.32 | 82.65 | 446.11 | 454.84 |
| 84.50167348456677 | 27.15 | 79.31 | 442.13 | 450.29 |
| 84.6690219412421 | 26.1 | 76.06 | 437.89 | 445.53 |
| 84.83637039791745 | 25.57 | 73 | 432.21 | 439.43 |
| 85.0037188545928 | 24.79 | 70.18 | 428.03 | 434.89 |
| 85.17106731126813 | 23.72 | 67.87 | 422.97 | 429.56 |
| 85.33841576794349 | 22.59 | 65.45 | 416.88 | 423.17 |
| 85.50576422461883 | 21.59 | 62.74 | 409.31 | 415.3 |
| 85.66381554481221 | 20.63 | 59.95 | 401.22 | 406.83 |
| 85.83116400148755 | 19.68 | 57.16 | 393.12 | 398.37 |
| 85.99851245816289 | 18.94 | 54.16 | 384.36 | 389.25 |
| 86.16586091483823 | 18.35 | 51.13 | 375.02 | 379.55 |
| 86.33320937151358 | 17.82 | 48.25 | 364.65 | 368.86 |
| 86.50055782818893 | 17.52 | 45.38 | 354.9 | 358.83 |
| 86.66790628486427 | 17.04 | 42.64 | 345.28 | 348.91 |
| 86.83525474153961 | 16.62 | 40.08 | 335.36 | 338.74 |
| 87.00260319821496 | 16.08 | 37.68 | 326.4 | 329.53 |
| 87.16995165489031 | 15.64 | 35.55 | 318.19 | 321.12 |
| 87.33730011156564 | 15.09 | 34.08 | 311.2 | 314.01 |
| 87.504648568241 | 14.53 | 32.47 | 304.13 | 306.79 |
| 87.67199702491634 | 13.97 | 30.61 | 296.89 | 299.35 |
| 87.83004834510972 | 13.45 | 28.75 | 289.64 | 291.9 |
| 87.99739680178506 | 12.94 | 27.02 | 282.91 | 284.98 |
| 88.1647452584604 | 12.39 | 25.65 | 277.48 | 279.41 |
| 88.33209371513574 | 11.8 | 24.57 | 272.32 | 274.12 |
| 88.49944217181108 | 11.19 | 23.89 | 266.98 | 268.7 |
| 88.66679062848644 | 10.53 | 23.22 | 261.91 | 263.55 |
| 88.83413908516178 | 9.84 | 22.57 | 257.12 | 258.69 |
| 89.00148754183712 | 9.3 | 21.48 | 252.76 | 254.21 |
| 89.16883599851246 | 8.49 | 20.2 | 250.86 | 252.12 |
| 89.33618445518782 | 7.51 | 18.92 | 248.83 | 249.88 |
| 89.50353291186315 | 6.55 | 17.6 | 245.86 | 246.75 |
| 89.6708813685385 | 5.73 | 16.33 | 242.33 | 243.09 |
| 89.83822982521386 | 5.05 | 15.45 | 238.74 | 239.42 |
| 90.00557828188919 | 4.42 | 15.09 | 235.11 | 235.76 |
| 90.16362960208257 | 3.87 | 14.98 | 231.46 | 232.1 |
| 90.3309780587579 | 3.26 | 15 | 227.84 | 228.49 |
| 90.49832651543326 | 2.44 | 14.83 | 224.51 | 225.13 |
| 90.66567497210859 | 1.82 | 14.26 | 220.81 | 221.37 |
| 90.83302342878395 | 1.22 | 14 | 217.2 | 217.74 |
| 91.00037188545929 | 0.61 | 13.96 | 213.72 | 214.26 |
| 91.16772034213463 | -0.07 | 13.92 | 210.31 | 210.84 |
| 91.33506879880998 | -0.8 | 13.82 | 206.93 | 207.45 |
| 91.50241725548533 | -1.46 | 13.65 | 203.97 | 204.49 |
| 91.66976571216065 | -2.11 | 13.68 | 201.62 | 202.16 |
| 91.83711416883601 | -2.83 | 14.39 | 199.72 | 200.35 |
| 92.00446262551137 | -3.47 | 14.84 | 198.19 | 198.89 |
| 92.1718110821867 | -4 | 14.81 | 196.74 | 197.46 |
| 92.33915953886203 | -4.37 | 15.03 | 194.49 | 195.25 |
| 92.49721085905541 | -4.78 | 15.85 | 192.11 | 192.97 |
| 92.66455931573077 | -5.42 | 16.61 | 190.55 | 191.52 |
| 92.83190777240611 | -6.2 | 17.45 | 189.83 | 190.91 |
| 92.99925622908145 | -6.99 | 18.45 | 189.22 | 190.44 |
| 93.1666046857568 | -7.8 | 19.75 | 188.83 | 190.22 |
| 93.33395314243214 | -8.55 | 20.91 | 188.39 | 189.91 |
| 93.50130159910749 | -9.26 | 22.09 | 187.98 | 189.62 |
| 93.66865005578283 | -9.96 | 23.83 | 187.97 | 189.84 |
| 93.83599851245818 | -10.32 | 25.56 | 188.31 | 190.4 |
| 94.00334696913353 | -11.02 | 27.57 | 189.1 | 191.51 |
| 94.17069542580886 | -11.38 | 29.39 | 190.88 | 193.57 |
| 94.3380438824842 | -11.64 | 31.24 | 193.27 | 196.25 |
| 94.50539233915954 | -11.81 | 32.86 | 195.73 | 198.94 |
| 94.66344365935292 | -11.9 | 34.3 | 198.23 | 201.66 |
| 94.83079211602828 | -12.31 | 35.9 | 200.91 | 204.6 |
| 94.99814057270362 | -12.84 | 37.67 | 203.47 | 207.46 |
| 95.16548902937897 | -13.59 | 40.02 | 206.06 | 210.47 |
| 95.33283748605432 | -14.27 | 42.54 | 209.22 | 214.1 |
| 95.50018594272963 | -14.86 | 44.97 | 212.65 | 217.99 |
| 95.66753439940499 | -15.43 | 47.51 | 216.1 | 221.94 |
| 95.83488285608034 | -16.08 | 50.46 | 220.21 | 226.62 |
| 96.00223131275567 | -16.56 | 53.52 | 225.05 | 232.07 |
| 96.16957976943102 | -16.96 | 56.71 | 230.35 | 237.99 |
| 96.33692822610638 | -17.33 | 59.93 | 235.91 | 244.17 |
| 96.50427668278171 | -17.74 | 63.27 | 241.85 | 250.76 |
| 96.67162513945706 | -18.09 | 66.49 | 247.64 | 257.2 |
| 96.8389735961324 | -18.6 | 70.47 | 255.25 | 265.61 |
| 96.99702491632577 | -18.61 | 74.22 | 263.7 | 274.72 |
| 97.16437337300111 | -18.45 | 77.95 | 272.62 | 284.29 |
| 97.33172182967647 | -18.25 | 81.72 | 281.8 | 294.11 |
| 97.49907028635181 | -17.69 | 84.9 | 289.89 | 302.72 |
| 97.66641874302715 | -17.13 | 87.69 | 296.83 | 310.11 |
| 97.8337671997025 | -16.53 | 90.19 | 303.46 | 317.13 |
| 98.00111565637785 | -15.67 | 92.33 | 310.02 | 323.97 |
| 98.16846411305319 | -14.7 | 93.95 | 315.49 | 329.63 |
| 98.33581256972855 | -13.48 | 94.39 | 318.48 | 332.57 |
| 98.50316102640389 | -12.35 | 94.69 | 321 | 335.03 |
| 98.67050948307921 | -11.27 | 95.47 | 324.37 | 338.43 |
| 98.83785793975456 | -9.88 | 93.6 | 324.05 | 337.61 |
| 99.0052063964299 | -8.59 | 91.49 | 323.49 | 336.5 |
| 99.17255485310525 | -7.3 | 89.4 | 322.95 | 335.43 |
| 99.33060617329863 | -6.25 | 87.73 | 323.45 | 335.49 |
| 99.49795462997399 | -5.31 | 86.92 | 325.26 | 337.04 |
| 99.66530308664933 | -4.41 | 86.33 | 327.41 | 338.97 |
| 99.83265154332467 | -3.35 | 85.13 | 329 | 340.21 |
| 100.0 | -2.45 | 84.53 | 331.15 | 342.14 |